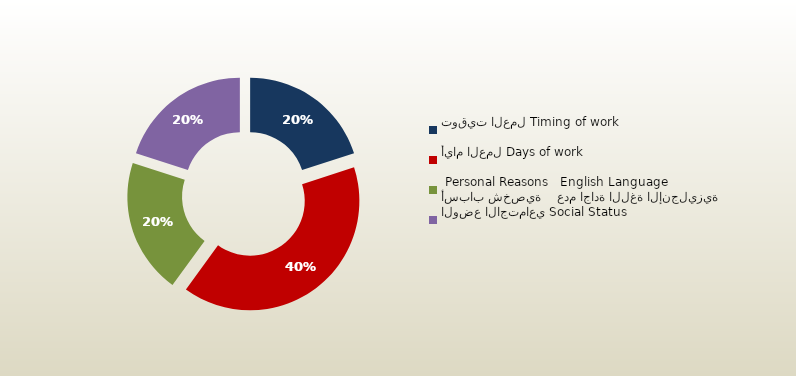
| Category | المجموع
Total |
|---|---|
| توقيت العمل Timing of work | 62 |
| أيام العمل Days of work | 124 |
| أسباب شخصية    عدم اجادة اللغة الإنجليزية
 Personal Reasons   English Language | 62 |
| الوضع الاجتماعي Social Status | 62 |